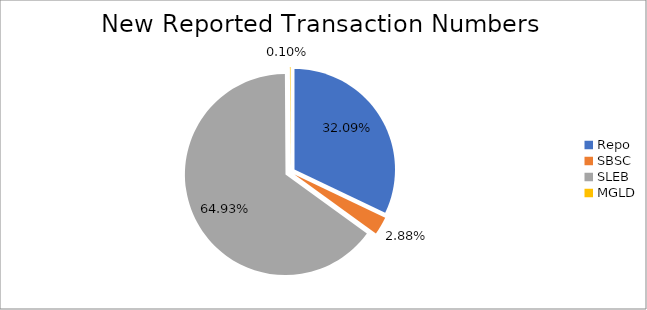
| Category | Series 0 |
|---|---|
| Repo | 369820 |
| SBSC | 33235 |
| SLEB | 748123 |
| MGLD | 1101 |